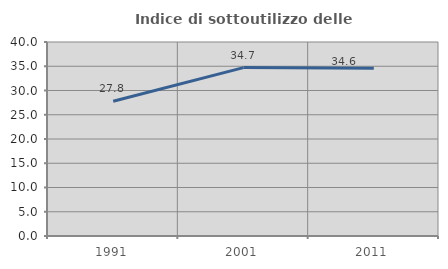
| Category | Indice di sottoutilizzo delle abitazioni  |
|---|---|
| 1991.0 | 27.776 |
| 2001.0 | 34.718 |
| 2011.0 | 34.596 |